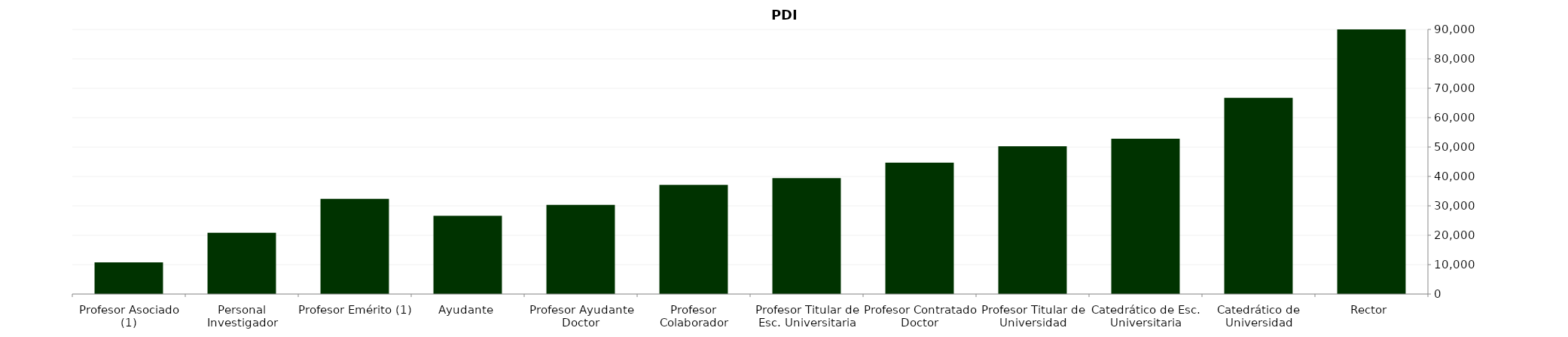
| Category | PDI |
|---|---|
| Rector | 91286.53 |
| Catedrático de Universidad | 66724.296 |
| Catedrático de Esc. Universitaria | 52811.28 |
| Profesor Titular de Universidad | 50229.202 |
| Profesor Contratado Doctor | 44700.233 |
| Profesor Titular de Esc. Universitaria | 39435.495 |
| Profesor Colaborador | 37138.556 |
| Profesor Ayudante Doctor | 30352.214 |
| Ayudante | 26590.485 |
| Profesor Emérito (1) | 32366.727 |
| Personal Investigador | 20854.139 |
| Profesor Asociado (1) | 10749.175 |